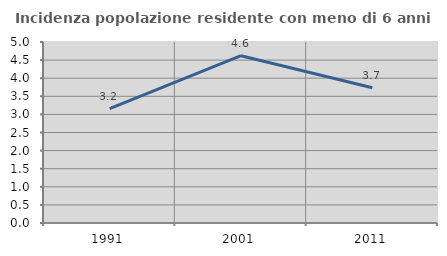
| Category | Incidenza popolazione residente con meno di 6 anni |
|---|---|
| 1991.0 | 3.162 |
| 2001.0 | 4.622 |
| 2011.0 | 3.738 |